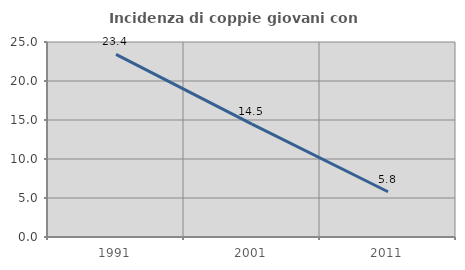
| Category | Incidenza di coppie giovani con figli |
|---|---|
| 1991.0 | 23.415 |
| 2001.0 | 14.47 |
| 2011.0 | 5.805 |